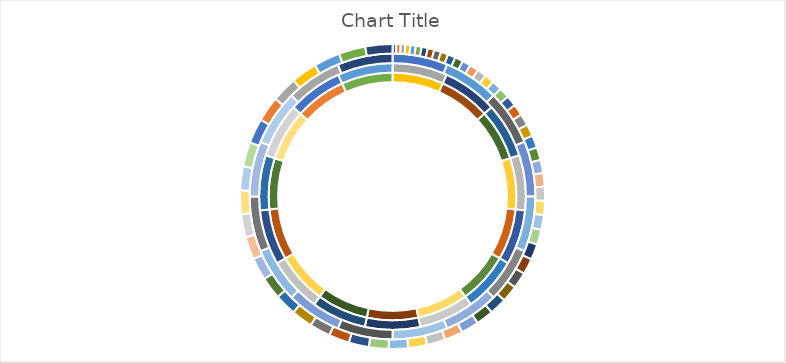
| Category | Odd/Even | Even/Even | Even/Odd | Step |
|---|---|---|---|---|
| 0.0 | 0 | 0 | 1 | 10 |
| 1.0 | 0 | 0 | 0 | 11 |
| 0.0 | 0 | 1 | 0 | 12 |
| 0.0 | 1 | 0 | 0 | 13 |
| 0.0 | 0 | 0 | 1 | 14 |
| 1.0 | 0 | 0 | 0 | 15 |
| 0.0 | 0 | 1 | 0 | 16 |
| 0.0 | 1 | 0 | 0 | 17 |
| 0.0 | 0 | 0 | 1 | 18 |
| 1.0 | 0 | 0 | 0 | 19 |
| 0.0 | 0 | 1 | 0 | 20 |
| 0.0 | 1 | 0 | 0 | 21 |
| 0.0 | 0 | 0 | 1 | 22 |
| 1.0 | 0 | 0 | 0 | 23 |
| 0.0 | 0 | 1 | 0 | 24 |
| 0.0 | 1 | 0 | 0 | 25 |
| 0.0 | 0 | 0 | 1 | 26 |
| 1.0 | 0 | 0 | 0 | 27 |
| 0.0 | 0 | 1 | 0 | 28 |
| 0.0 | 1 | 0 | 0 | 29 |
| 0.0 | 0 | 0 | 1 | 30 |
| 1.0 | 0 | 0 | 0 | 31 |
| 0.0 | 0 | 1 | 0 | 32 |
| 0.0 | 1 | 0 | 0 | 33 |
| 0.0 | 0 | 0 | 1 | 34 |
| 1.0 | 0 | 0 | 0 | 35 |
| 0.0 | 0 | 1 | 0 | 36 |
| 0.0 | 1 | 0 | 0 | 37 |
| 0.0 | 0 | 0 | 1 | 38 |
| 1.0 | 0 | 0 | 0 | 39 |
| 0.0 | 0 | 1 | 0 | 40 |
| 0.0 | 1 | 0 | 0 | 41 |
| 0.0 | 0 | 0 | 1 | 42 |
| 1.0 | 0 | 0 | 0 | 43 |
| 0.0 | 0 | 1 | 0 | 44 |
| 0.0 | 1 | 0 | 0 | 45 |
| 0.0 | 0 | 0 | 1 | 46 |
| 1.0 | 0 | 0 | 0 | 47 |
| 0.0 | 0 | 1 | 0 | 48 |
| 0.0 | 1 | 0 | 0 | 49 |
| 0.0 | 0 | 0 | 1 | 50 |
| 1.0 | 0 | 0 | 0 | 51 |
| 0.0 | 0 | 1 | 0 | 52 |
| 0.0 | 1 | 0 | 0 | 53 |
| 0.0 | 0 | 0 | 1 | 54 |
| 1.0 | 0 | 0 | 0 | 55 |
| 0.0 | 0 | 1 | 0 | 56 |
| 0.0 | 1 | 0 | 0 | 57 |
| 0.0 | 0 | 0 | 1 | 58 |
| 1.0 | 0 | 0 | 0 | 59 |
| 0.0 | 0 | 1 | 0 | 60 |
| 0.0 | 1 | 0 | 0 | 61 |
| 0.0 | 0 | 0 | 1 | 62 |
| 1.0 | 0 | 0 | 0 | 63 |
| 0.0 | 0 | 1 | 0 | 64 |
| 0.0 | 1 | 0 | 0 | 65 |
| 0.0 | 0 | 0 | 1 | 66 |
| 1.0 | 0 | 0 | 0 | 67 |
| 0.0 | 0 | 1 | 0 | 68 |
| 0.0 | 1 | 0 | 0 | 69 |
| 0.0 | 0 | 0 | 1 | 70 |